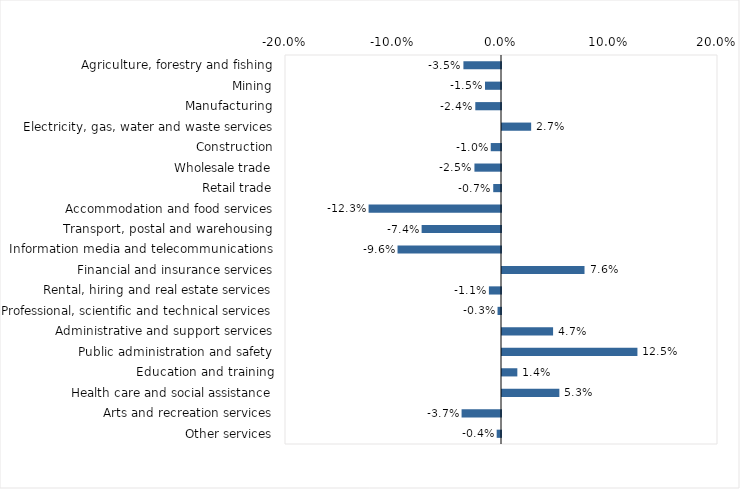
| Category | This week |
|---|---|
| Agriculture, forestry and fishing | -0.035 |
| Mining | -0.015 |
| Manufacturing | -0.024 |
| Electricity, gas, water and waste services | 0.027 |
| Construction | -0.01 |
| Wholesale trade | -0.025 |
| Retail trade | -0.007 |
| Accommodation and food services | -0.123 |
| Transport, postal and warehousing | -0.074 |
| Information media and telecommunications | -0.096 |
| Financial and insurance services | 0.076 |
| Rental, hiring and real estate services | -0.011 |
| Professional, scientific and technical services | -0.003 |
| Administrative and support services | 0.047 |
| Public administration and safety | 0.125 |
| Education and training | 0.014 |
| Health care and social assistance | 0.053 |
| Arts and recreation services | -0.036 |
| Other services | -0.004 |